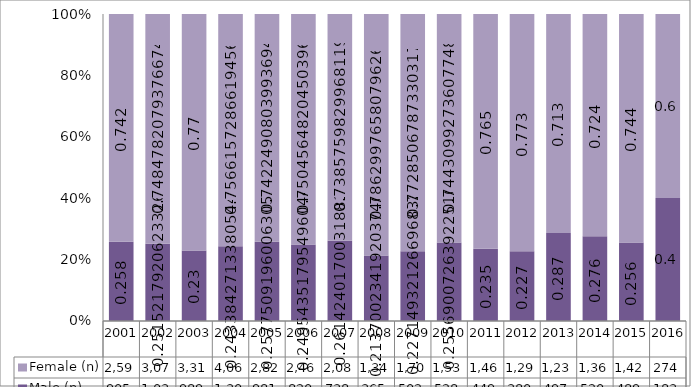
| Category | Male (n) | Female (n) |
|---|---|---|
| 2001.0 | 905 | 2596 |
| 2002.0 | 1033 | 3074 |
| 2003.0 | 989 | 3311 |
| 2004.0 | 1306 | 4060 |
| 2005.0 | 981 | 2825 |
| 2006.0 | 820 | 2466 |
| 2007.0 | 738 | 2085 |
| 2008.0 | 365 | 1343 |
| 2009.0 | 502 | 1708 |
| 2010.0 | 528 | 1537 |
| 2011.0 | 449 | 1460 |
| 2012.0 | 380 | 1294 |
| 2013.0 | 497 | 1236 |
| 2014.0 | 520 | 1361 |
| 2015.0 | 489 | 1422 |
| 2016.0 | 183 | 274 |